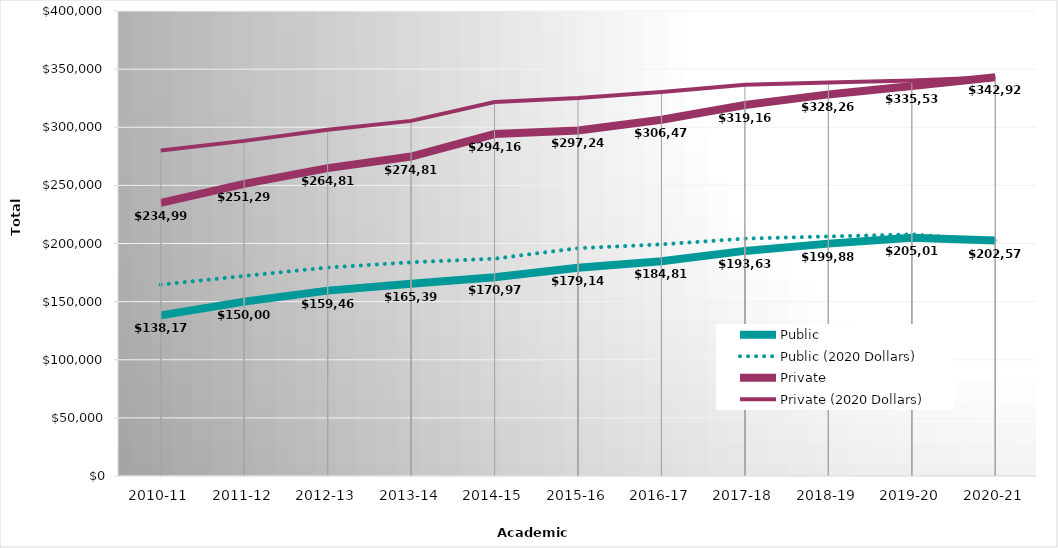
| Category | Public | Public (2020 Dollars) | Private | Private (2020 Dollars) |
|---|---|---|---|---|
| 2010-11 | 138174 | 164640.594 | 234992 | 280003.636 |
| 2011-12 | 150007 | 172083.356 | 251290 | 288272.058 |
| 2012-13 | 159460 | 179356.07 | 264810 | 297850.752 |
| 2013-14 | 165394 | 183851.943 | 274811 | 305479.862 |
| 2014-15 | 170971 | 186951.827 | 294169 | 321665.265 |
| 2015-16 | 179142.68 | 195958.121 | 297246.04 | 325147.393 |
| 2016-17 | 184815.95 | 199247.38 | 306475.19 | 330406.433 |
| 2017-18 | 193638.08 | 204198.728 | 319168.58 | 336575.419 |
| 2018-19 | 199881.23 | 206089.746 | 328260.54 | 338456.65 |
| 2019-20 | 205019.28 | 207830.774 | 335535.93 | 340137.241 |
| 2020-21 | 202571.38 | 202571.38 | 342927.22 | 342927.22 |